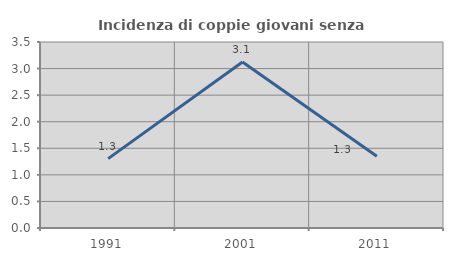
| Category | Incidenza di coppie giovani senza figli |
|---|---|
| 1991.0 | 1.306 |
| 2001.0 | 3.125 |
| 2011.0 | 1.349 |